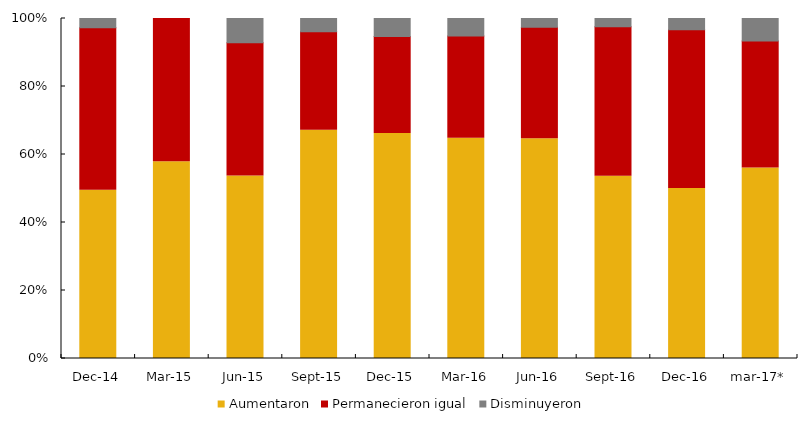
| Category | Aumentaron | Permanecieron igual | Disminuyeron |
|---|---|---|---|
| dic-14 | 58.065 | 56 | 3.226 |
| mar-15 | 44 | 32 | 0 |
| jun-15 | 60 | 43.8 | 8 |
| sep-15 | 53.1 | 22.9 | 3.1 |
| dic-15 | 71.4 | 30.769 | 5.7 |
| mar-16 | 64.103 | 29.73 | 5.128 |
| jun-16 | 67.568 | 34.286 | 2.703 |
| sep-16 | 62.857 | 51.515 | 2.857 |
| dic-16 | 45.455 | 42.424 | 3.03 |
| mar-17* | 51.515 | 34.375 | 6.061 |